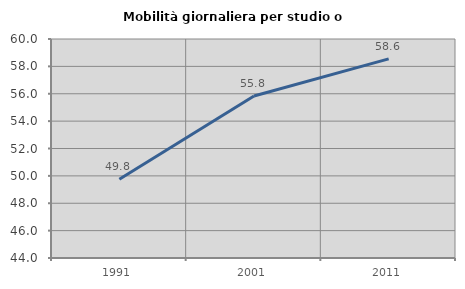
| Category | Mobilità giornaliera per studio o lavoro |
|---|---|
| 1991.0 | 49.758 |
| 2001.0 | 55.84 |
| 2011.0 | 58.552 |